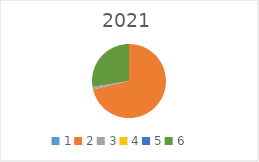
| Category | Series 0 |
|---|---|
| 1.0 | 0 |
| 2.0 | 1584904.76 |
| 3.0 | 24363.9 |
| 4.0 | 0 |
| 5.0 | 0 |
| 6.0 | 611801.42 |